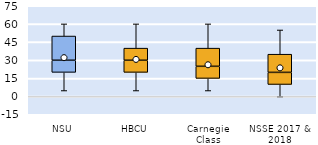
| Category | 25th | 50th | 75th |
|---|---|---|---|
| NSU | 20 | 10 | 20 |
| HBCU | 20 | 10 | 10 |
| Carnegie Class | 15 | 10 | 15 |
| NSSE 2017 & 2018 | 10 | 10 | 15 |